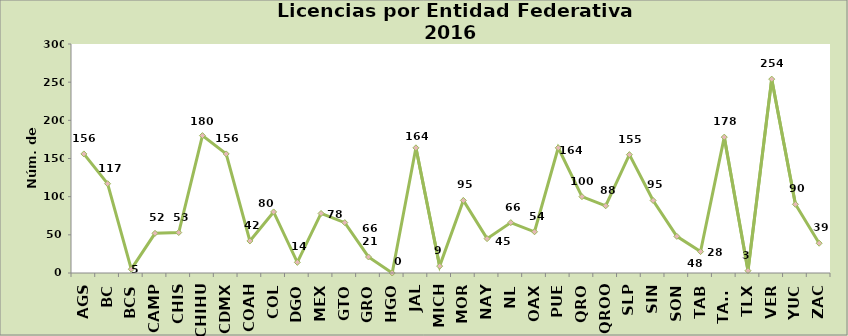
| Category | Series 0 |
|---|---|
| AGS | 156 |
| BC | 117 |
| BCS | 5 |
| CAMP | 52 |
| CHIS | 53 |
| CHIHU | 180 |
| CDMX | 156 |
| COAH | 42 |
| COL | 80 |
| DGO | 14 |
| MEX | 78 |
| GTO | 66 |
| GRO | 21 |
| HGO | 0 |
| JAL | 164 |
| MICH | 9 |
| MOR | 95 |
| NAY | 45 |
| NL | 66 |
| OAX | 54 |
| PUE | 164 |
| QRO | 100 |
| QROO | 88 |
| SLP | 155 |
| SIN | 95 |
| SON | 48 |
| TAB | 28 |
| TAMS | 178 |
| TLX | 3 |
| VER | 254 |
| YUC | 90 |
| ZAC | 39 |